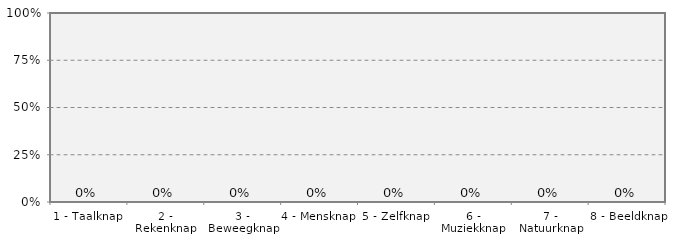
| Category | Score per MI gebied |
|---|---|
| 1 - Taalknap | 0 |
| 2 - Rekenknap | 0 |
| 3 - Beweegknap | 0 |
| 4 - Mensknap | 0 |
| 5 - Zelfknap | 0 |
| 6 - Muziekknap | 0 |
| 7 - Natuurknap | 0 |
| 8 - Beeldknap | 0 |